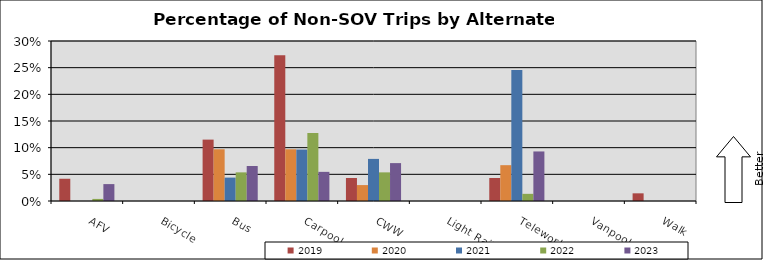
| Category | 2019 | 2020 | 2021 | 2022 | 2023 |
|---|---|---|---|---|---|
| AFV | 0.042 | 0 | 0 | 0.004 | 0.032 |
| Bicycle | 0 | 0 | 0 | 0 | 0 |
| Bus | 0.115 | 0.097 | 0.044 | 0.054 | 0.066 |
| Carpool | 0.273 | 0.097 | 0.096 | 0.128 | 0.055 |
| CWW | 0.043 | 0.03 | 0.079 | 0.054 | 0.071 |
| Light Rail | 0 | 0 | 0 | 0 | 0 |
| Telework | 0.043 | 0.067 | 0.246 | 0.013 | 0.093 |
| Vanpool | 0 | 0 | 0 | 0 | 0 |
| Walk | 0.014 | 0 | 0 | 0 | 0 |